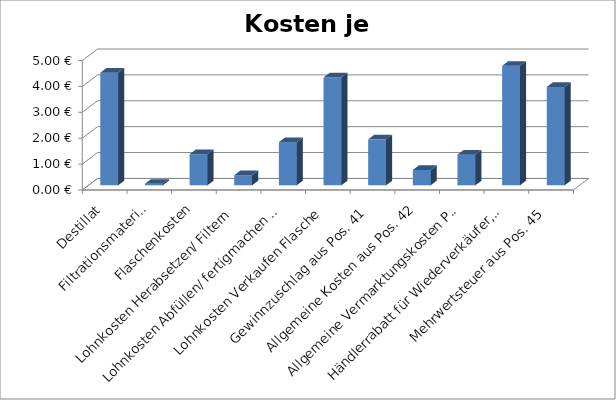
| Category | Kosten je Flasche |
|---|---|
| Destillat | 4.349 |
| Filtrationsmaterial | 0.06 |
| Flaschenkosten | 1.2 |
| Lohnkosten Herabsetzen/ Filtern | 0.391 |
| Lohnkosten Abfüllen/ fertigmachen Flasche | 1.667 |
| Lohnkosten Verkaufen Flasche | 4.167 |
| Gewinnzuschlag aus Pos. 41 | 1.775 |
| Allgemeine Kosten aus Pos. 42 | 0.592 |
| Allgemeine Vermarktungskosten Pos. 43 | 1.183 |
| Händlerrabatt für Wiederverkäufer, Handelsvertreter Pos. 44 | 4.615 |
| Mehrwertsteuer aus Pos. 45 | 3.799 |